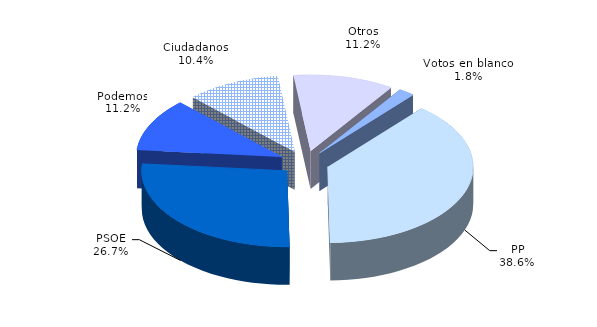
| Category | 2015 |
|---|---|
| PP | 63094 |
| PSOE | 43689 |
| Podemos | 18319 |
| Ciudadanos | 17042 |
| Otros | 18290 |
| Votos en blanco | 2933 |